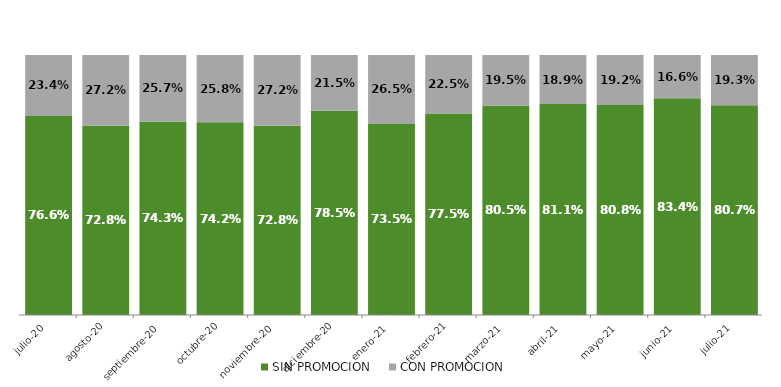
| Category | SIN PROMOCION   | CON PROMOCION   |
|---|---|---|
| 2020-07-01 | 0.766 | 0.234 |
| 2020-08-01 | 0.728 | 0.272 |
| 2020-09-01 | 0.743 | 0.257 |
| 2020-10-01 | 0.742 | 0.258 |
| 2020-11-01 | 0.728 | 0.272 |
| 2020-12-01 | 0.785 | 0.215 |
| 2021-01-01 | 0.735 | 0.265 |
| 2021-02-01 | 0.775 | 0.225 |
| 2021-03-01 | 0.805 | 0.195 |
| 2021-04-01 | 0.811 | 0.189 |
| 2021-05-01 | 0.808 | 0.192 |
| 2021-06-01 | 0.834 | 0.166 |
| 2021-07-01 | 0.807 | 0.193 |